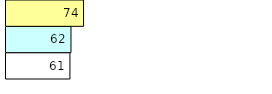
| Category | Total Standouts | Total Recd | Total Tipsters |
|---|---|---|---|
| 0 | 61 | 62 | 74 |